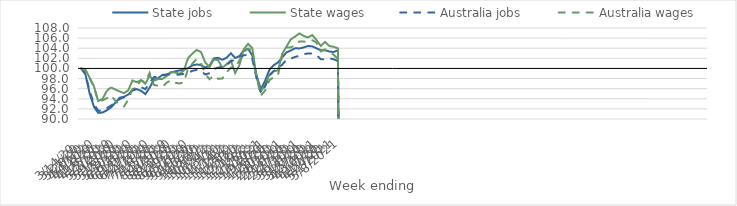
| Category | State jobs | State wages | Australia jobs | Australia wages |
|---|---|---|---|---|
| 14/03/2020 | 100 | 100 | 100 | 100 |
| 21/03/2020 | 98.842 | 99.802 | 98.971 | 99.603 |
| 28/03/2020 | 95.023 | 98.156 | 95.467 | 98.105 |
| 04/04/2020 | 92.406 | 96.425 | 92.92 | 96.234 |
| 11/04/2020 | 91.211 | 93.538 | 91.647 | 93.487 |
| 18/04/2020 | 91.291 | 93.984 | 91.63 | 93.692 |
| 25/04/2020 | 91.719 | 95.576 | 92.16 | 94.108 |
| 02/05/2020 | 92.308 | 96.258 | 92.657 | 94.655 |
| 09/05/2020 | 93.212 | 95.825 | 93.343 | 93.578 |
| 16/05/2020 | 94.205 | 95.455 | 93.935 | 92.812 |
| 23/05/2020 | 94.403 | 95.11 | 94.291 | 92.462 |
| 30/05/2020 | 94.832 | 95.677 | 94.798 | 93.79 |
| 06/06/2020 | 95.618 | 97.621 | 95.781 | 95.926 |
| 13/06/2020 | 95.912 | 97.266 | 96.28 | 96.602 |
| 20/06/2020 | 95.57 | 97.708 | 96.296 | 97.58 |
| 27/06/2020 | 94.926 | 96.975 | 95.902 | 97.326 |
| 04/07/2020 | 96.198 | 98.534 | 97.157 | 99.113 |
| 11/07/2020 | 97.755 | 97.589 | 98.279 | 96.733 |
| 18/07/2020 | 98.078 | 97.894 | 98.382 | 96.561 |
| 25/07/2020 | 98.73 | 97.934 | 98.604 | 96.362 |
| 01/08/2020 | 98.786 | 98.494 | 98.826 | 97.197 |
| 08/08/2020 | 99.181 | 99.29 | 98.822 | 97.652 |
| 15/08/2020 | 99.436 | 99.205 | 98.73 | 97.16 |
| 22/08/2020 | 99.605 | 98.921 | 98.792 | 97.027 |
| 29/08/2020 | 99.742 | 99.588 | 98.928 | 97.246 |
| 05/09/2020 | 100.076 | 102.051 | 99.113 | 99.964 |
| 12/09/2020 | 100.595 | 102.942 | 99.531 | 100.967 |
| 19/09/2020 | 100.791 | 103.654 | 99.714 | 101.852 |
| 26/09/2020 | 100.682 | 103.266 | 99.52 | 101.02 |
| 03/10/2020 | 100.155 | 101.189 | 98.806 | 98.883 |
| 10/10/2020 | 100.524 | 100.28 | 99.055 | 97.873 |
| 17/10/2020 | 101.985 | 101.759 | 99.899 | 98.568 |
| 24/10/2020 | 102.107 | 101.664 | 100.18 | 97.964 |
| 31/10/2020 | 101.717 | 100.118 | 100.306 | 97.998 |
| 07/11/2020 | 102.119 | 100.853 | 100.68 | 99.252 |
| 14/11/2020 | 102.999 | 101.562 | 101.424 | 100.173 |
| 21/11/2020 | 102.066 | 99.097 | 101.745 | 100.229 |
| 28/11/2020 | 102.442 | 100.687 | 102.059 | 101.576 |
| 05/12/2020 | 103.527 | 103.784 | 102.608 | 103.362 |
| 12/12/2020 | 103.924 | 104.856 | 102.679 | 103.837 |
| 19/12/2020 | 102.559 | 104.013 | 101.871 | 103.708 |
| 26/12/2020 | 98.597 | 98.163 | 98.073 | 98.239 |
| 02/01/2021 | 95.876 | 95.462 | 95.142 | 94.651 |
| 09/01/2021 | 97.594 | 96.673 | 96.464 | 95.644 |
| 16/01/2021 | 99.728 | 98.771 | 98.546 | 97.678 |
| 23/01/2021 | 100.639 | 99.451 | 99.493 | 98.293 |
| 30/01/2021 | 101.187 | 99.62 | 99.995 | 98.662 |
| 06/02/2021 | 102.2 | 102.888 | 100.749 | 102.61 |
| 13/02/2021 | 103.184 | 104.346 | 101.78 | 104.166 |
| 20/02/2021 | 103.546 | 105.765 | 101.937 | 104.163 |
| 27/02/2021 | 104.004 | 106.31 | 102.282 | 104.593 |
| 06/03/2021 | 103.952 | 106.926 | 102.496 | 105.335 |
| 13/03/2021 | 104.158 | 106.428 | 102.825 | 105.317 |
| 20/03/2021 | 104.435 | 106.126 | 102.964 | 105.281 |
| 27/03/2021 | 104.376 | 106.605 | 102.951 | 105.588 |
| 03/04/2021 | 103.986 | 105.615 | 102.614 | 105.117 |
| 10/04/2021 | 103.613 | 104.468 | 101.84 | 103.377 |
| 17/04/2021 | 103.597 | 105.247 | 101.797 | 103.762 |
| 24/04/2021 | 103.354 | 104.451 | 102 | 103.175 |
| 01/05/2021 | 103.243 | 104.27 | 101.825 | 102.713 |
| 08/05/2021 | 103.58 | 103.988 | 101.453 | 101.885 |